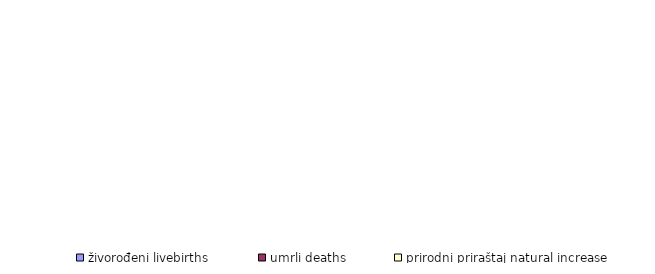
| Category | živorođeni livebirths | umrli deaths | prirodni priraštaj natural increase |
|---|---|---|---|
| Unsko - sanski | 193 | 169 | 24 |
| Kanton Posavski | 11 | 30 | -19 |
| Tuzlanski | 356 | 388 | -32 |
| Zeničko - dobojski | 372 | 283 | 89 |
| Bosansko - podrinjski | 18 | 22 | -4 |
| Srednjobosanski | 184 | 211 | -27 |
| Hercegovačko-
neretvanski | 157 | 175 | -18 |
| Zapadnohercegovački | 77 | 78 | -1 |
| Kanton Sarajevo | 516 | 396 | 120 |
| Kanton 10 | 31 | 63 | -32 |